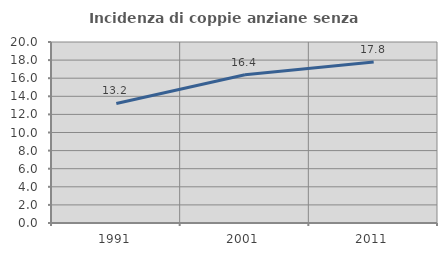
| Category | Incidenza di coppie anziane senza figli  |
|---|---|
| 1991.0 | 13.209 |
| 2001.0 | 16.382 |
| 2011.0 | 17.789 |